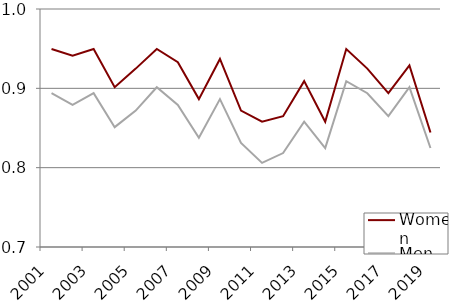
| Category | Women | Men |
|---|---|---|
| 2001.0 | 0.95 | 0.894 |
| 2002.0 | 0.941 | 0.879 |
| 2003.0 | 0.95 | 0.894 |
| 2004.0 | 0.901 | 0.851 |
| 2005.0 | 0.925 | 0.872 |
| 2006.0 | 0.95 | 0.901 |
| 2007.0 | 0.933 | 0.879 |
| 2008.0 | 0.886 | 0.838 |
| 2009.0 | 0.937 | 0.886 |
| 2010.0 | 0.872 | 0.831 |
| 2011.0 | 0.858 | 0.806 |
| 2012.0 | 0.865 | 0.818 |
| 2013.0 | 0.909 | 0.858 |
| 2014.0 | 0.858 | 0.825 |
| 2015.0 | 0.95 | 0.909 |
| 2016.0 | 0.925 | 0.894 |
| 2017.0 | 0.894 | 0.865 |
| 2018.0 | 0.929 | 0.901 |
| 2019.0 | 0.844 | 0.825 |